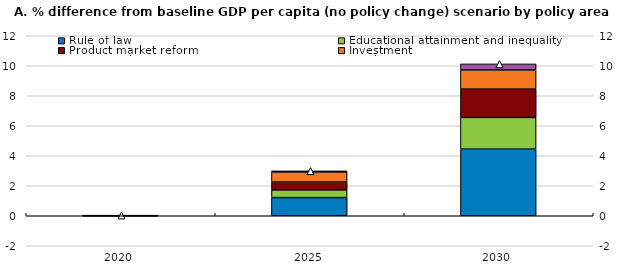
| Category | Rule of law | Educational attainment and inequality | Product market reform | Investment | R&D spending |
|---|---|---|---|---|---|
| 2020.0 | 0 | -0.001 | 0.002 | 0.037 | 0 |
| 2025.0 | 1.212 | 0.511 | 0.526 | 0.669 | 0.074 |
| 2030.0 | 4.441 | 2.113 | 1.89 | 1.276 | 0.403 |